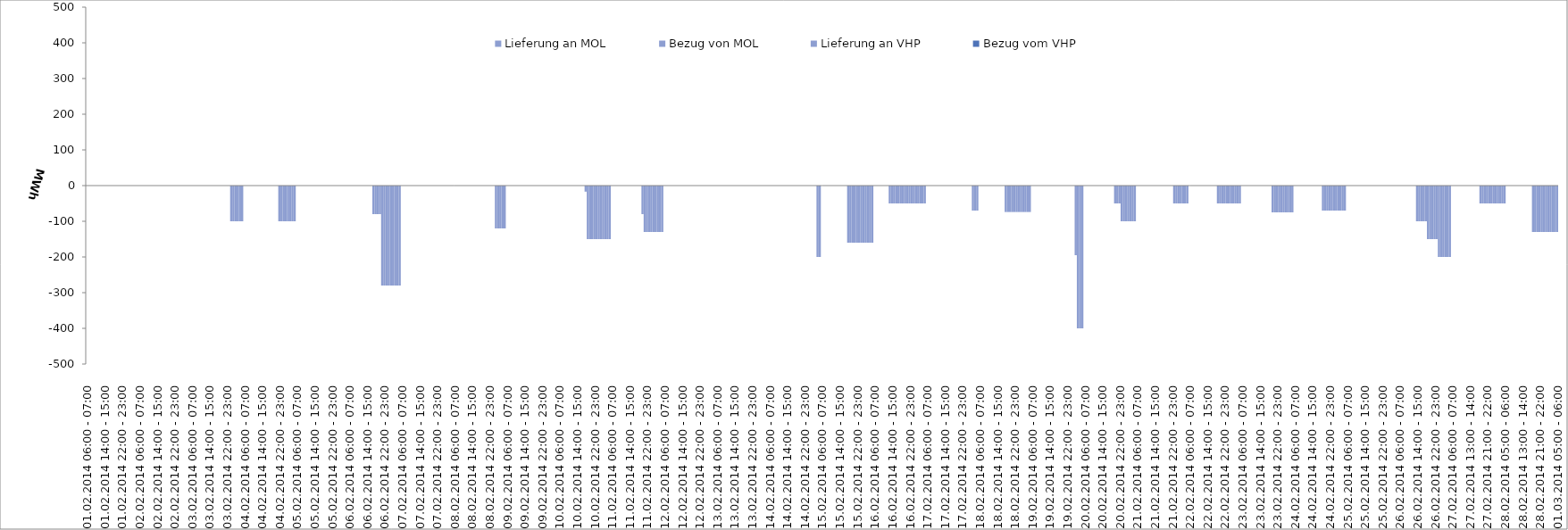
| Category | Bezug vom VHP | Lieferung an VHP | Bezug von MOL | Lieferung an MOL |
|---|---|---|---|---|
| 01.02.2014 06:00 - 07:00 | 0 | 0 | 0 | 0 |
| 01.02.2014 07:00 - 08:00 | 0 | 0 | 0 | 0 |
| 01.02.2014 08:00 - 09:00 | 0 | 0 | 0 | 0 |
| 01.02.2014 09:00 - 10:00 | 0 | 0 | 0 | 0 |
| 01.02.2014 10:00 - 11:00 | 0 | 0 | 0 | 0 |
| 01.02.2014 11:00 - 12:00 | 0 | 0 | 0 | 0 |
| 01.02.2014 12:00 - 13:00 | 0 | 0 | 0 | 0 |
| 01.02.2014 13:00 - 14:00 | 0 | 0 | 0 | 0 |
| 01.02.2014 14:00 - 15:00 | 0 | 0 | 0 | 0 |
| 01.02.2014 15:00 - 16:00 | 0 | 0 | 0 | 0 |
| 01.02.2014 16:00 - 17:00 | 0 | 0 | 0 | 0 |
| 01.02.2014 17:00 - 18:00 | 0 | 0 | 0 | 0 |
| 01.02.2014 18:00 - 19:00 | 0 | 0 | 0 | 0 |
| 01.02.2014 19:00 - 20:00 | 0 | 0 | 0 | 0 |
| 01.02.2014 20:00 - 21:00 | 0 | 0 | 0 | 0 |
| 01.02.2014 21:00 - 22:00 | 0 | 0 | 0 | 0 |
| 01.02.2014 22:00 - 23:00 | 0 | 0 | 0 | 0 |
| 01.02.2014 23:00 - 24:00 | 0 | 0 | 0 | 0 |
| 02.02.2014 00:00 - 01:00 | 0 | 0 | 0 | 0 |
| 02.02.2014 01:00 - 02:00 | 0 | 0 | 0 | 0 |
| 02.02.2014 02:00 - 03:00 | 0 | 0 | 0 | 0 |
| 02.02.2014 03:00 - 04:00 | 0 | 0 | 0 | 0 |
| 02.02.2014 04:00 - 05:00 | 0 | 0 | 0 | 0 |
| 02.02.2014 05:00 - 06:00 | 0 | 0 | 0 | 0 |
| 02.02.2014 06:00 - 07:00 | 0 | 0 | 0 | 0 |
| 02.02.2014 07:00 - 08:00 | 0 | 0 | 0 | 0 |
| 02.02.2014 08:00 - 09:00 | 0 | 0 | 0 | 0 |
| 02.02.2014 09:00 - 10:00 | 0 | 0 | 0 | 0 |
| 02.02.2014 10:00 - 11:00 | 0 | 0 | 0 | 0 |
| 02.02.2014 11:00 - 12:00 | 0 | 0 | 0 | 0 |
| 02.02.2014 12:00 - 13:00 | 0 | 0 | 0 | 0 |
| 02.02.2014 13:00 - 14:00 | 0 | 0 | 0 | 0 |
| 02.02.2014 14:00 - 15:00 | 0 | 0 | 0 | 0 |
| 02.02.2014 15:00 - 16:00 | 0 | 0 | 0 | 0 |
| 02.02.2014 16:00 - 17:00 | 0 | 0 | 0 | 0 |
| 02.02.2014 17:00 - 18:00 | 0 | 0 | 0 | 0 |
| 02.02.2014 18:00 - 19:00 | 0 | 0 | 0 | 0 |
| 02.02.2014 19:00 - 20:00 | 0 | 0 | 0 | 0 |
| 02.02.2014 20:00 - 21:00 | 0 | 0 | 0 | 0 |
| 02.02.2014 21:00 - 22:00 | 0 | 0 | 0 | 0 |
| 02.02.2014 22:00 - 23:00 | 0 | 0 | 0 | 0 |
| 02.02.2014 23:00 - 24:00 | 0 | 0 | 0 | 0 |
| 03.02.2014 00:00 - 01:00 | 0 | 0 | 0 | 0 |
| 03.02.2014 01:00 - 02:00 | 0 | 0 | 0 | 0 |
| 03.02.2014 02:00 - 03:00 | 0 | 0 | 0 | 0 |
| 03.02.2014 03:00 - 04:00 | 0 | 0 | 0 | 0 |
| 03.02.2014 04:00 - 05:00 | 0 | 0 | 0 | 0 |
| 03.02.2014 05:00 - 06:00 | 0 | 0 | 0 | 0 |
| 03.02.2014 06:00 - 07:00 | 0 | 0 | 0 | 0 |
| 03.02.2014 07:00 - 08:00 | 0 | 0 | 0 | 0 |
| 03.02.2014 08:00 - 09:00 | 0 | 0 | 0 | 0 |
| 03.02.2014 09:00 - 10:00 | 0 | 0 | 0 | 0 |
| 03.02.2014 10:00 - 11:00 | 0 | 0 | 0 | 0 |
| 03.02.2014 11:00 - 12:00 | 0 | 0 | 0 | 0 |
| 03.02.2014 12:00 - 13:00 | 0 | 0 | 0 | 0 |
| 03.02.2014 13:00 - 14:00 | 0 | 0 | 0 | 0 |
| 03.02.2014 14:00 - 15:00 | 0 | 0 | 0 | 0 |
| 03.02.2014 15:00 - 16:00 | 0 | 0 | 0 | 0 |
| 03.02.2014 16:00 - 17:00 | 0 | 0 | 0 | 0 |
| 03.02.2014 17:00 - 18:00 | 0 | 0 | 0 | 0 |
| 03.02.2014 18:00 - 19:00 | 0 | 0 | 0 | 0 |
| 03.02.2014 19:00 - 20:00 | 0 | 0 | 0 | 0 |
| 03.02.2014 20:00 - 21:00 | 0 | 0 | 0 | 0 |
| 03.02.2014 21:00 - 22:00 | 0 | 0 | 0 | 0 |
| 03.02.2014 22:00 - 23:00 | 0 | 0 | 0 | 0 |
| 03.02.2014 23:00 - 24:00 | 0 | 0 | 0 | 0 |
| 04.02.2014 00:00 - 01:00 | 0 | -100 | 0 | 0 |
| 04.02.2014 01:00 - 02:00 | 0 | -100 | 0 | 0 |
| 04.02.2014 02:00 - 03:00 | 0 | -100 | 0 | 0 |
| 04.02.2014 03:00 - 04:00 | 0 | -100 | 0 | 0 |
| 04.02.2014 04:00 - 05:00 | 0 | -100 | 0 | 0 |
| 04.02.2014 05:00 - 06:00 | 0 | -100 | 0 | 0 |
| 04.02.2014 06:00 - 07:00 | 0 | 0 | 0 | 0 |
| 04.02.2014 07:00 - 08:00 | 0 | 0 | 0 | 0 |
| 04.02.2014 08:00 - 09:00 | 0 | 0 | 0 | 0 |
| 04.02.2014 09:00 - 10:00 | 0 | 0 | 0 | 0 |
| 04.02.2014 10:00 - 11:00 | 0 | 0 | 0 | 0 |
| 04.02.2014 11:00 - 12:00 | 0 | 0 | 0 | 0 |
| 04.02.2014 12:00 - 13:00 | 0 | 0 | 0 | 0 |
| 04.02.2014 13:00 - 14:00 | 0 | 0 | 0 | 0 |
| 04.02.2014 14:00 - 15:00 | 0 | 0 | 0 | 0 |
| 04.02.2014 15:00 - 16:00 | 0 | 0 | 0 | 0 |
| 04.02.2014 16:00 - 17:00 | 0 | 0 | 0 | 0 |
| 04.02.2014 17:00 - 18:00 | 0 | 0 | 0 | 0 |
| 04.02.2014 18:00 - 19:00 | 0 | 0 | 0 | 0 |
| 04.02.2014 19:00 - 20:00 | 0 | 0 | 0 | 0 |
| 04.02.2014 20:00 - 21:00 | 0 | 0 | 0 | 0 |
| 04.02.2014 21:00 - 22:00 | 0 | 0 | 0 | 0 |
| 04.02.2014 22:00 - 23:00 | 0 | -100 | 0 | 0 |
| 04.02.2014 23:00 - 24:00 | 0 | -100 | 0 | 0 |
| 05.02.2014 00:00 - 01:00 | 0 | -100 | 0 | 0 |
| 05.02.2014 01:00 - 02:00 | 0 | -100 | 0 | 0 |
| 05.02.2014 02:00 - 03:00 | 0 | -100 | 0 | 0 |
| 05.02.2014 03:00 - 04:00 | 0 | -100 | 0 | 0 |
| 05.02.2014 04:00 - 05:00 | 0 | -100 | 0 | 0 |
| 05.02.2014 05:00 - 06:00 | 0 | -100 | 0 | 0 |
| 05.02.2014 06:00 - 07:00 | 0 | 0 | 0 | 0 |
| 05.02.2014 07:00 - 08:00 | 0 | 0 | 0 | 0 |
| 05.02.2014 08:00 - 09:00 | 0 | 0 | 0 | 0 |
| 05.02.2014 09:00 - 10:00 | 0 | 0 | 0 | 0 |
| 05.02.2014 10:00 - 11:00 | 0 | 0 | 0 | 0 |
| 05.02.2014 11:00 - 12:00 | 0 | 0 | 0 | 0 |
| 05.02.2014 12:00 - 13:00 | 0 | 0 | 0 | 0 |
| 05.02.2014 13:00 - 14:00 | 0 | 0 | 0 | 0 |
| 05.02.2014 14:00 - 15:00 | 0 | 0 | 0 | 0 |
| 05.02.2014 15:00 - 16:00 | 0 | 0 | 0 | 0 |
| 05.02.2014 16:00 - 17:00 | 0 | 0 | 0 | 0 |
| 05.02.2014 17:00 - 18:00 | 0 | 0 | 0 | 0 |
| 05.02.2014 18:00 - 19:00 | 0 | 0 | 0 | 0 |
| 05.02.2014 19:00 - 20:00 | 0 | 0 | 0 | 0 |
| 05.02.2014 20:00 - 21:00 | 0 | 0 | 0 | 0 |
| 05.02.2014 21:00 - 22:00 | 0 | 0 | 0 | 0 |
| 05.02.2014 22:00 - 23:00 | 0 | 0 | 0 | 0 |
| 05.02.2014 23:00 - 24:00 | 0 | 0 | 0 | 0 |
| 06.02.2014 00:00 - 01:00 | 0 | 0 | 0 | 0 |
| 06.02.2014 01:00 - 02:00 | 0 | 0 | 0 | 0 |
| 06.02.2014 02:00 - 03:00 | 0 | 0 | 0 | 0 |
| 06.02.2014 03:00 - 04:00 | 0 | 0 | 0 | 0 |
| 06.02.2014 04:00 - 05:00 | 0 | 0 | 0 | 0 |
| 06.02.2014 05:00 - 06:00 | 0 | 0 | 0 | 0 |
| 06.02.2014 06:00 - 07:00 | 0 | 0 | 0 | 0 |
| 06.02.2014 07:00 - 08:00 | 0 | 0 | 0 | 0 |
| 06.02.2014 08:00 - 09:00 | 0 | 0 | 0 | 0 |
| 06.02.2014 09:00 - 10:00 | 0 | 0 | 0 | 0 |
| 06.02.2014 10:00 - 11:00 | 0 | 0 | 0 | 0 |
| 06.02.2014 11:00 - 12:00 | 0 | 0 | 0 | 0 |
| 06.02.2014 12:00 - 13:00 | 0 | 0 | 0 | 0 |
| 06.02.2014 13:00 - 14:00 | 0 | 0 | 0 | 0 |
| 06.02.2014 14:00 - 15:00 | 0 | 0 | 0 | 0 |
| 06.02.2014 15:00 - 16:00 | 0 | 0 | 0 | 0 |
| 06.02.2014 16:00 - 17:00 | 0 | 0 | 0 | 0 |
| 06.02.2014 17:00 - 18:00 | 0 | -80 | 0 | 0 |
| 06.02.2014 18:00 - 19:00 | 0 | -80 | 0 | 0 |
| 06.02.2014 19:00 - 20:00 | 0 | -80 | 0 | 0 |
| 06.02.2014 20:00 - 21:00 | 0 | -80 | 0 | 0 |
| 06.02.2014 21:00 - 22:00 | 0 | -280 | 0 | 0 |
| 06.02.2014 22:00 - 23:00 | 0 | -280 | 0 | 0 |
| 06.02.2014 23:00 - 24:00 | 0 | -280 | 0 | 0 |
| 07.02.2014 00:00 - 01:00 | 0 | -280 | 0 | 0 |
| 07.02.2014 01:00 - 02:00 | 0 | -280 | 0 | 0 |
| 07.02.2014 02:00 - 03:00 | 0 | -280 | 0 | 0 |
| 07.02.2014 03:00 - 04:00 | 0 | -280 | 0 | 0 |
| 07.02.2014 04:00 - 05:00 | 0 | -280 | 0 | 0 |
| 07.02.2014 05:00 - 06:00 | 0 | -280 | 0 | 0 |
| 07.02.2014 06:00 - 07:00 | 0 | 0 | 0 | 0 |
| 07.02.2014 07:00 - 08:00 | 0 | 0 | 0 | 0 |
| 07.02.2014 08:00 - 09:00 | 0 | 0 | 0 | 0 |
| 07.02.2014 09:00 - 10:00 | 0 | 0 | 0 | 0 |
| 07.02.2014 10:00 - 11:00 | 0 | 0 | 0 | 0 |
| 07.02.2014 11:00 - 12:00 | 0 | 0 | 0 | 0 |
| 07.02.2014 12:00 - 13:00 | 0 | 0 | 0 | 0 |
| 07.02.2014 13:00 - 14:00 | 0 | 0 | 0 | 0 |
| 07.02.2014 14:00 - 15:00 | 0 | 0 | 0 | 0 |
| 07.02.2014 15:00 - 16:00 | 0 | 0 | 0 | 0 |
| 07.02.2014 16:00 - 17:00 | 0 | 0 | 0 | 0 |
| 07.02.2014 17:00 - 18:00 | 0 | 0 | 0 | 0 |
| 07.02.2014 18:00 - 19:00 | 0 | 0 | 0 | 0 |
| 07.02.2014 19:00 - 20:00 | 0 | 0 | 0 | 0 |
| 07.02.2014 20:00 - 21:00 | 0 | 0 | 0 | 0 |
| 07.02.2014 21:00 - 22:00 | 0 | 0 | 0 | 0 |
| 07.02.2014 22:00 - 23:00 | 0 | 0 | 0 | 0 |
| 07.02.2014 23:00 - 24:00 | 0 | 0 | 0 | 0 |
| 08.02.2014 00:00 - 01:00 | 0 | 0 | 0 | 0 |
| 08.02.2014 01:00 - 02:00 | 0 | 0 | 0 | 0 |
| 08.02.2014 02:00 - 03:00 | 0 | 0 | 0 | 0 |
| 08.02.2014 03:00 - 04:00 | 0 | 0 | 0 | 0 |
| 08.02.2014 04:00 - 05:00 | 0 | 0 | 0 | 0 |
| 08.02.2014 05:00 - 06:00 | 0 | 0 | 0 | 0 |
| 08.02.2014 06:00 - 07:00 | 0 | 0 | 0 | 0 |
| 08.02.2014 07:00 - 08:00 | 0 | 0 | 0 | 0 |
| 08.02.2014 08:00 - 09:00 | 0 | 0 | 0 | 0 |
| 08.02.2014 09:00 - 10:00 | 0 | 0 | 0 | 0 |
| 08.02.2014 10:00 - 11:00 | 0 | 0 | 0 | 0 |
| 08.02.2014 11:00 - 12:00 | 0 | 0 | 0 | 0 |
| 08.02.2014 12:00 - 13:00 | 0 | 0 | 0 | 0 |
| 08.02.2014 13:00 - 14:00 | 0 | 0 | 0 | 0 |
| 08.02.2014 14:00 - 15:00 | 0 | 0 | 0 | 0 |
| 08.02.2014 15:00 - 16:00 | 0 | 0 | 0 | 0 |
| 08.02.2014 16:00 - 17:00 | 0 | 0 | 0 | 0 |
| 08.02.2014 17:00 - 18:00 | 0 | 0 | 0 | 0 |
| 08.02.2014 18:00 - 19:00 | 0 | 0 | 0 | 0 |
| 08.02.2014 19:00 - 20:00 | 0 | 0 | 0 | 0 |
| 08.02.2014 20:00 - 21:00 | 0 | 0 | 0 | 0 |
| 08.02.2014 21:00 - 22:00 | 0 | 0 | 0 | 0 |
| 08.02.2014 22:00 - 23:00 | 0 | 0 | 0 | 0 |
| 08.02.2014 23:00 - 24:00 | 0 | 0 | 0 | 0 |
| 09.02.2014 00:00 - 01:00 | 0 | 0 | 0 | 0 |
| 09.02.2014 01:00 - 02:00 | 0 | -120 | 0 | 0 |
| 09.02.2014 02:00 - 03:00 | 0 | -120 | 0 | 0 |
| 09.02.2014 03:00 - 04:00 | 0 | -120 | 0 | 0 |
| 09.02.2014 04:00 - 05:00 | 0 | -120 | 0 | 0 |
| 09.02.2014 05:00 - 06:00 | 0 | -120 | 0 | 0 |
| 09.02.2014 06:00 - 07:00 | 0 | 0 | 0 | 0 |
| 09.02.2014 07:00 - 08:00 | 0 | 0 | 0 | 0 |
| 09.02.2014 08:00 - 09:00 | 0 | 0 | 0 | 0 |
| 09.02.2014 09:00 - 10:00 | 0 | 0 | 0 | 0 |
| 09.02.2014 10:00 - 11:00 | 0 | 0 | 0 | 0 |
| 09.02.2014 11:00 - 12:00 | 0 | 0 | 0 | 0 |
| 09.02.2014 12:00 - 13:00 | 0 | 0 | 0 | 0 |
| 09.02.2014 13:00 - 14:00 | 0 | 0 | 0 | 0 |
| 09.02.2014 14:00 - 15:00 | 0 | 0 | 0 | 0 |
| 09.02.2014 15:00 - 16:00 | 0 | 0 | 0 | 0 |
| 09.02.2014 16:00 - 17:00 | 0 | 0 | 0 | 0 |
| 09.02.2014 17:00 - 18:00 | 0 | 0 | 0 | 0 |
| 09.02.2014 18:00 - 19:00 | 0 | 0 | 0 | 0 |
| 09.02.2014 19:00 - 20:00 | 0 | 0 | 0 | 0 |
| 09.02.2014 20:00 - 21:00 | 0 | 0 | 0 | 0 |
| 09.02.2014 21:00 - 22:00 | 0 | 0 | 0 | 0 |
| 09.02.2014 22:00 - 23:00 | 0 | 0 | 0 | 0 |
| 09.02.2014 23:00 - 24:00 | 0 | 0 | 0 | 0 |
| 10.02.2014 00:00 - 01:00 | 0 | 0 | 0 | 0 |
| 10.02.2014 01:00 - 02:00 | 0 | 0 | 0 | 0 |
| 10.02.2014 02:00 - 03:00 | 0 | 0 | 0 | 0 |
| 10.02.2014 03:00 - 04:00 | 0 | 0 | 0 | 0 |
| 10.02.2014 04:00 - 05:00 | 0 | 0 | 0 | 0 |
| 10.02.2014 05:00 - 06:00 | 0 | 0 | 0 | 0 |
| 10.02.2014 06:00 - 07:00 | 0 | 0 | 0 | 0 |
| 10.02.2014 07:00 - 08:00 | 0 | 0 | 0 | 0 |
| 10.02.2014 08:00 - 09:00 | 0 | 0 | 0 | 0 |
| 10.02.2014 09:00 - 10:00 | 0 | 0 | 0 | 0 |
| 10.02.2014 10:00 - 11:00 | 0 | 0 | 0 | 0 |
| 10.02.2014 11:00 - 12:00 | 0 | 0 | 0 | 0 |
| 10.02.2014 12:00 - 13:00 | 0 | 0 | 0 | 0 |
| 10.02.2014 13:00 - 14:00 | 0 | 0 | 0 | 0 |
| 10.02.2014 14:00 - 15:00 | 0 | 0 | 0 | 0 |
| 10.02.2014 15:00 - 16:00 | 0 | 0 | 0 | 0 |
| 10.02.2014 16:00 - 17:00 | 0 | 0 | 0 | 0 |
| 10.02.2014 17:00 - 18:00 | 0 | 0 | 0 | 0 |
| 10.02.2014 18:00 - 19:00 | 0 | -17 | 0 | 0 |
| 10.02.2014 19:00 - 20:00 | 0 | -150 | 0 | 0 |
| 10.02.2014 20:00 - 21:00 | 0 | -150 | 0 | 0 |
| 10.02.2014 21:00 - 22:00 | 0 | -150 | 0 | 0 |
| 10.02.2014 22:00 - 23:00 | 0 | -150 | 0 | 0 |
| 10.02.2014 23:00 - 24:00 | 0 | -150 | 0 | 0 |
| 11.02.2014 00:00 - 01:00 | 0 | -150 | 0 | 0 |
| 11.02.2014 01:00 - 02:00 | 0 | -150 | 0 | 0 |
| 11.02.2014 02:00 - 03:00 | 0 | -150 | 0 | 0 |
| 11.02.2014 03:00 - 04:00 | 0 | -150 | 0 | 0 |
| 11.02.2014 04:00 - 05:00 | 0 | -150 | 0 | 0 |
| 11.02.2014 05:00 - 06:00 | 0 | -150 | 0 | 0 |
| 11.02.2014 06:00 - 07:00 | 0 | 0 | 0 | 0 |
| 11.02.2014 07:00 - 08:00 | 0 | 0 | 0 | 0 |
| 11.02.2014 08:00 - 09:00 | 0 | 0 | 0 | 0 |
| 11.02.2014 09:00 - 10:00 | 0 | 0 | 0 | 0 |
| 11.02.2014 10:00 - 11:00 | 0 | 0 | 0 | 0 |
| 11.02.2014 11:00 - 12:00 | 0 | 0 | 0 | 0 |
| 11.02.2014 12:00 - 13:00 | 0 | 0 | 0 | 0 |
| 11.02.2014 13:00 - 14:00 | 0 | 0 | 0 | 0 |
| 11.02.2014 14:00 - 15:00 | 0 | 0 | 0 | 0 |
| 11.02.2014 15:00 - 16:00 | 0 | 0 | 0 | 0 |
| 11.02.2014 16:00 - 17:00 | 0 | 0 | 0 | 0 |
| 11.02.2014 17:00 - 18:00 | 0 | 0 | 0 | 0 |
| 11.02.2014 18:00 - 19:00 | 0 | 0 | 0 | 0 |
| 11.02.2014 19:00 - 20:00 | 0 | 0 | 0 | 0 |
| 11.02.2014 20:00 - 21:00 | 0 | -80 | 0 | 0 |
| 11.02.2014 21:00 - 22:00 | 0 | -130 | 0 | 0 |
| 11.02.2014 22:00 - 23:00 | 0 | -130 | 0 | 0 |
| 11.02.2014 23:00 - 24:00 | 0 | -130 | 0 | 0 |
| 12.02.2014 00:00 - 01:00 | 0 | -130 | 0 | 0 |
| 12.02.2014 01:00 - 02:00 | 0 | -130 | 0 | 0 |
| 12.02.2014 02:00 - 03:00 | 0 | -130 | 0 | 0 |
| 12.02.2014 03:00 - 04:00 | 0 | -130 | 0 | 0 |
| 12.02.2014 04:00 - 05:00 | 0 | -130 | 0 | 0 |
| 12.02.2014 05:00 - 06:00 | 0 | -130 | 0 | 0 |
| 12.02.2014 06:00 - 07:00 | 0 | 0 | 0 | 0 |
| 12.02.2014 07:00 - 08:00 | 0 | 0 | 0 | 0 |
| 12.02.2014 08:00 - 09:00 | 0 | 0 | 0 | 0 |
| 12.02.2014 09:00 - 10:00 | 0 | 0 | 0 | 0 |
| 12.02.2014 10:00 - 11:00 | 0 | 0 | 0 | 0 |
| 12.02.2014 11:00 - 12:00 | 0 | 0 | 0 | 0 |
| 12.02.2014 12:00 - 13:00 | 0 | 0 | 0 | 0 |
| 12.02.2014 13:00 - 14:00 | 0 | 0 | 0 | 0 |
| 12.02.2014 14:00 - 15:00 | 0 | 0 | 0 | 0 |
| 12.02.2014 15:00 - 16:00 | 0 | 0 | 0 | 0 |
| 12.02.2014 16:00 - 17:00 | 0 | 0 | 0 | 0 |
| 12.02.2014 17:00 - 18:00 | 0 | 0 | 0 | 0 |
| 12.02.2014 18:00 - 19:00 | 0 | 0 | 0 | 0 |
| 12.02.2014 19:00 - 20:00 | 0 | 0 | 0 | 0 |
| 12.02.2014 20:00 - 21:00 | 0 | 0 | 0 | 0 |
| 12.02.2014 21:00 - 22:00 | 0 | 0 | 0 | 0 |
| 12.02.2014 22:00 - 23:00 | 0 | 0 | 0 | 0 |
| 12.02.2014 23:00 - 24:00 | 0 | 0 | 0 | 0 |
| 13.02.2014 00:00 - 01:00 | 0 | 0 | 0 | 0 |
| 13.02.2014 01:00 - 02:00 | 0 | 0 | 0 | 0 |
| 13.02.2014 02:00 - 03:00 | 0 | 0 | 0 | 0 |
| 13.02.2014 03:00 - 04:00 | 0 | 0 | 0 | 0 |
| 13.02.2014 04:00 - 05:00 | 0 | 0 | 0 | 0 |
| 13.02.2014 05:00 - 06:00 | 0 | 0 | 0 | 0 |
| 13.02.2014 06:00 - 07:00 | 0 | 0 | 0 | 0 |
| 13.02.2014 07:00 - 08:00 | 0 | 0 | 0 | 0 |
| 13.02.2014 08:00 - 09:00 | 0 | 0 | 0 | 0 |
| 13.02.2014 09:00 - 10:00 | 0 | 0 | 0 | 0 |
| 13.02.2014 10:00 - 11:00 | 0 | 0 | 0 | 0 |
| 13.02.2014 11:00 - 12:00 | 0 | 0 | 0 | 0 |
| 13.02.2014 12:00 - 13:00 | 0 | 0 | 0 | 0 |
| 13.02.2014 13:00 - 14:00 | 0 | 0 | 0 | 0 |
| 13.02.2014 14:00 - 15:00 | 0 | 0 | 0 | 0 |
| 13.02.2014 15:00 - 16:00 | 0 | 0 | 0 | 0 |
| 13.02.2014 16:00 - 17:00 | 0 | 0 | 0 | 0 |
| 13.02.2014 17:00 - 18:00 | 0 | 0 | 0 | 0 |
| 13.02.2014 18:00 - 19:00 | 0 | 0 | 0 | 0 |
| 13.02.2014 19:00 - 20:00 | 0 | 0 | 0 | 0 |
| 13.02.2014 20:00 - 21:00 | 0 | 0 | 0 | 0 |
| 13.02.2014 21:00 - 22:00 | 0 | 0 | 0 | 0 |
| 13.02.2014 22:00 - 23:00 | 0 | 0 | 0 | 0 |
| 13.02.2014 23:00 - 24:00 | 0 | 0 | 0 | 0 |
| 14.02.2014 00:00 - 01:00 | 0 | 0 | 0 | 0 |
| 14.02.2014 01:00 - 02:00 | 0 | 0 | 0 | 0 |
| 14.02.2014 02:00 - 03:00 | 0 | 0 | 0 | 0 |
| 14.02.2014 03:00 - 04:00 | 0 | 0 | 0 | 0 |
| 14.02.2014 04:00 - 05:00 | 0 | 0 | 0 | 0 |
| 14.02.2014 05:00 - 06:00 | 0 | 0 | 0 | 0 |
| 14.02.2014 06:00 - 07:00 | 0 | 0 | 0 | 0 |
| 14.02.2014 07:00 - 08:00 | 0 | 0 | 0 | 0 |
| 14.02.2014 08:00 - 09:00 | 0 | 0 | 0 | 0 |
| 14.02.2014 09:00 - 10:00 | 0 | 0 | 0 | 0 |
| 14.02.2014 10:00 - 11:00 | 0 | 0 | 0 | 0 |
| 14.02.2014 11:00 - 12:00 | 0 | 0 | 0 | 0 |
| 14.02.2014 12:00 - 13:00 | 0 | 0 | 0 | 0 |
| 14.02.2014 13:00 - 14:00 | 0 | 0 | 0 | 0 |
| 14.02.2014 14:00 - 15:00 | 0 | 0 | 0 | 0 |
| 14.02.2014 15:00 - 16:00 | 0 | 0 | 0 | 0 |
| 14.02.2014 16:00 - 17:00 | 0 | 0 | 0 | 0 |
| 14.02.2014 17:00 - 18:00 | 0 | 0 | 0 | 0 |
| 14.02.2014 18:00 - 19:00 | 0 | 0 | 0 | 0 |
| 14.02.2014 19:00 - 20:00 | 0 | 0 | 0 | 0 |
| 14.02.2014 20:00 - 21:00 | 0 | 0 | 0 | 0 |
| 14.02.2014 21:00 - 22:00 | 0 | 0 | 0 | 0 |
| 14.02.2014 22:00 - 23:00 | 0 | 0 | 0 | 0 |
| 14.02.2014 23:00 - 24:00 | 0 | 0 | 0 | 0 |
| 15.02.2014 00:00 - 01:00 | 0 | 0 | 0 | 0 |
| 15.02.2014 01:00 - 02:00 | 0 | 0 | 0 | 0 |
| 15.02.2014 02:00 - 03:00 | 0 | 0 | 0 | 0 |
| 15.02.2014 03:00 - 04:00 | 0 | 0 | 0 | 0 |
| 15.02.2014 04:00 - 05:00 | 0 | -200 | 0 | 0 |
| 15.02.2014 05:00 - 06:00 | 0 | -200 | 0 | 0 |
| 15.02.2014 06:00 - 07:00 | 0 | 0 | 0 | 0 |
| 15.02.2014 07:00 - 08:00 | 0 | 0 | 0 | 0 |
| 15.02.2014 08:00 - 09:00 | 0 | 0 | 0 | 0 |
| 15.02.2014 09:00 - 10:00 | 0 | 0 | 0 | 0 |
| 15.02.2014 10:00 - 11:00 | 0 | 0 | 0 | 0 |
| 15.02.2014 11:00 - 12:00 | 0 | 0 | 0 | 0 |
| 15.02.2014 12:00 - 13:00 | 0 | 0 | 0 | 0 |
| 15.02.2014 13:00 - 14:00 | 0 | 0 | 0 | 0 |
| 15.02.2014 14:00 - 15:00 | 0 | 0 | 0 | 0 |
| 15.02.2014 15:00 - 16:00 | 0 | 0 | 0 | 0 |
| 15.02.2014 16:00 - 17:00 | 0 | 0 | 0 | 0 |
| 15.02.2014 17:00 - 18:00 | 0 | 0 | 0 | 0 |
| 15.02.2014 18:00 - 19:00 | 0 | -160 | 0 | 0 |
| 15.02.2014 19:00 - 20:00 | 0 | -160 | 0 | 0 |
| 15.02.2014 20:00 - 21:00 | 0 | -160 | 0 | 0 |
| 15.02.2014 21:00 - 22:00 | 0 | -160 | 0 | 0 |
| 15.02.2014 22:00 - 23:00 | 0 | -160 | 0 | 0 |
| 15.02.2014 23:00 - 24:00 | 0 | -160 | 0 | 0 |
| 16.02.2014 00:00 - 01:00 | 0 | -160 | 0 | 0 |
| 16.02.2014 01:00 - 02:00 | 0 | -160 | 0 | 0 |
| 16.02.2014 02:00 - 03:00 | 0 | -160 | 0 | 0 |
| 16.02.2014 03:00 - 04:00 | 0 | -160 | 0 | 0 |
| 16.02.2014 04:00 - 05:00 | 0 | -160 | 0 | 0 |
| 16.02.2014 05:00 - 06:00 | 0 | -160 | 0 | 0 |
| 16.02.2014 06:00 - 07:00 | 0 | 0 | 0 | 0 |
| 16.02.2014 07:00 - 08:00 | 0 | 0 | 0 | 0 |
| 16.02.2014 08:00 - 09:00 | 0 | 0 | 0 | 0 |
| 16.02.2014 09:00 - 10:00 | 0 | 0 | 0 | 0 |
| 16.02.2014 10:00 - 11:00 | 0 | 0 | 0 | 0 |
| 16.02.2014 11:00 - 12:00 | 0 | 0 | 0 | 0 |
| 16.02.2014 12:00 - 13:00 | 0 | 0 | 0 | 0 |
| 16.02.2014 13:00 - 14:00 | 0 | -50 | 0 | 0 |
| 16.02.2014 14:00 - 15:00 | 0 | -50 | 0 | 0 |
| 16.02.2014 15:00 - 16:00 | 0 | -50 | 0 | 0 |
| 16.02.2014 16:00 - 17:00 | 0 | -50 | 0 | 0 |
| 16.02.2014 17:00 - 18:00 | 0 | -50 | 0 | 0 |
| 16.02.2014 18:00 - 19:00 | 0 | -50 | 0 | 0 |
| 16.02.2014 19:00 - 20:00 | 0 | -50 | 0 | 0 |
| 16.02.2014 20:00 - 21:00 | 0 | -50 | 0 | 0 |
| 16.02.2014 21:00 - 22:00 | 0 | -50 | 0 | 0 |
| 16.02.2014 22:00 - 23:00 | 0 | -50 | 0 | 0 |
| 16.02.2014 23:00 - 24:00 | 0 | -50 | 0 | 0 |
| 17.02.2014 00:00 - 01:00 | 0 | -50 | 0 | 0 |
| 17.02.2014 01:00 - 02:00 | 0 | -50 | 0 | 0 |
| 17.02.2014 02:00 - 03:00 | 0 | -50 | 0 | 0 |
| 17.02.2014 03:00 - 04:00 | 0 | -50 | 0 | 0 |
| 17.02.2014 04:00 - 05:00 | 0 | -50 | 0 | 0 |
| 17.02.2014 05:00 - 06:00 | 0 | -50 | 0 | 0 |
| 17.02.2014 06:00 - 07:00 | 0 | 0 | 0 | 0 |
| 17.02.2014 07:00 - 08:00 | 0 | 0 | 0 | 0 |
| 17.02.2014 08:00 - 09:00 | 0 | 0 | 0 | 0 |
| 17.02.2014 09:00 - 10:00 | 0 | 0 | 0 | 0 |
| 17.02.2014 10:00 - 11:00 | 0 | 0 | 0 | 0 |
| 17.02.2014 11:00 - 12:00 | 0 | 0 | 0 | 0 |
| 17.02.2014 12:00 - 13:00 | 0 | 0 | 0 | 0 |
| 17.02.2014 13:00 - 14:00 | 0 | 0 | 0 | 0 |
| 17.02.2014 14:00 - 15:00 | 0 | 0 | 0 | 0 |
| 17.02.2014 15:00 - 16:00 | 0 | 0 | 0 | 0 |
| 17.02.2014 16:00 - 17:00 | 0 | 0 | 0 | 0 |
| 17.02.2014 17:00 - 18:00 | 0 | 0 | 0 | 0 |
| 17.02.2014 18:00 - 19:00 | 0 | 0 | 0 | 0 |
| 17.02.2014 19:00 - 20:00 | 0 | 0 | 0 | 0 |
| 17.02.2014 20:00 - 21:00 | 0 | 0 | 0 | 0 |
| 17.02.2014 21:00 - 22:00 | 0 | 0 | 0 | 0 |
| 17.02.2014 22:00 - 23:00 | 0 | 0 | 0 | 0 |
| 17.02.2014 23:00 - 24:00 | 0 | 0 | 0 | 0 |
| 18.02.2014 00:00 - 01:00 | 0 | 0 | 0 | 0 |
| 18.02.2014 01:00 - 02:00 | 0 | 0 | 0 | 0 |
| 18.02.2014 02:00 - 03:00 | 0 | 0 | 0 | 0 |
| 18.02.2014 03:00 - 04:00 | 0 | -70 | 0 | 0 |
| 18.02.2014 04:00 - 05:00 | 0 | -70 | 0 | 0 |
| 18.02.2014 05:00 - 06:00 | 0 | -70 | 0 | 0 |
| 18.02.2014 06:00 - 07:00 | 0 | 0 | 0 | 0 |
| 18.02.2014 07:00 - 08:00 | 0 | 0 | 0 | 0 |
| 18.02.2014 08:00 - 09:00 | 0 | 0 | 0 | 0 |
| 18.02.2014 09:00 - 10:00 | 0 | 0 | 0 | 0 |
| 18.02.2014 10:00 - 11:00 | 0 | 0 | 0 | 0 |
| 18.02.2014 11:00 - 12:00 | 0 | 0 | 0 | 0 |
| 18.02.2014 12:00 - 13:00 | 0 | 0 | 0 | 0 |
| 18.02.2014 13:00 - 14:00 | 0 | 0 | 0 | 0 |
| 18.02.2014 14:00 - 15:00 | 0 | 0 | 0 | 0 |
| 18.02.2014 15:00 - 16:00 | 0 | 0 | 0 | 0 |
| 18.02.2014 16:00 - 17:00 | 0 | 0 | 0 | 0 |
| 18.02.2014 17:00 - 18:00 | 0 | 0 | 0 | 0 |
| 18.02.2014 18:00 - 19:00 | 0 | -74 | 0 | 0 |
| 18.02.2014 19:00 - 20:00 | 0 | -74 | 0 | 0 |
| 18.02.2014 20:00 - 21:00 | 0 | -74 | 0 | 0 |
| 18.02.2014 21:00 - 22:00 | 0 | -74 | 0 | 0 |
| 18.02.2014 22:00 - 23:00 | 0 | -74 | 0 | 0 |
| 18.02.2014 23:00 - 24:00 | 0 | -74 | 0 | 0 |
| 19.02.2014 00:00 - 01:00 | 0 | -74 | 0 | 0 |
| 19.02.2014 01:00 - 02:00 | 0 | -74 | 0 | 0 |
| 19.02.2014 02:00 - 03:00 | 0 | -74 | 0 | 0 |
| 19.02.2014 03:00 - 04:00 | 0 | -74 | 0 | 0 |
| 19.02.2014 04:00 - 05:00 | 0 | -74 | 0 | 0 |
| 19.02.2014 05:00 - 06:00 | 0 | -74 | 0 | 0 |
| 19.02.2014 06:00 - 07:00 | 0 | 0 | 0 | 0 |
| 19.02.2014 07:00 - 08:00 | 0 | 0 | 0 | 0 |
| 19.02.2014 08:00 - 09:00 | 0 | 0 | 0 | 0 |
| 19.02.2014 09:00 - 10:00 | 0 | 0 | 0 | 0 |
| 19.02.2014 10:00 - 11:00 | 0 | 0 | 0 | 0 |
| 19.02.2014 11:00 - 12:00 | 0 | 0 | 0 | 0 |
| 19.02.2014 12:00 - 13:00 | 0 | 0 | 0 | 0 |
| 19.02.2014 13:00 - 14:00 | 0 | 0 | 0 | 0 |
| 19.02.2014 14:00 - 15:00 | 0 | 0 | 0 | 0 |
| 19.02.2014 15:00 - 16:00 | 0 | 0 | 0 | 0 |
| 19.02.2014 16:00 - 17:00 | 0 | 0 | 0 | 0 |
| 19.02.2014 17:00 - 18:00 | 0 | 0 | 0 | 0 |
| 19.02.2014 18:00 - 19:00 | 0 | 0 | 0 | 0 |
| 19.02.2014 19:00 - 20:00 | 0 | 0 | 0 | 0 |
| 19.02.2014 20:00 - 21:00 | 0 | 0 | 0 | 0 |
| 19.02.2014 21:00 - 22:00 | 0 | 0 | 0 | 0 |
| 19.02.2014 22:00 - 23:00 | 0 | 0 | 0 | 0 |
| 19.02.2014 23:00 - 24:00 | 0 | 0 | 0 | 0 |
| 20.02.2014 00:00 - 01:00 | 0 | 0 | 0 | 0 |
| 20.02.2014 01:00 - 02:00 | 0 | 0 | 0 | 0 |
| 20.02.2014 02:00 - 03:00 | 0 | -195 | 0 | 0 |
| 20.02.2014 03:00 - 04:00 | 0 | -400 | 0 | 0 |
| 20.02.2014 04:00 - 05:00 | 0 | -400 | 0 | 0 |
| 20.02.2014 05:00 - 06:00 | 0 | -400 | 0 | 0 |
| 20.02.2014 06:00 - 07:00 | 0 | 0 | 0 | 0 |
| 20.02.2014 07:00 - 08:00 | 0 | 0 | 0 | 0 |
| 20.02.2014 08:00 - 09:00 | 0 | 0 | 0 | 0 |
| 20.02.2014 09:00 - 10:00 | 0 | 0 | 0 | 0 |
| 20.02.2014 10:00 - 11:00 | 0 | 0 | 0 | 0 |
| 20.02.2014 11:00 - 12:00 | 0 | 0 | 0 | 0 |
| 20.02.2014 12:00 - 13:00 | 0 | 0 | 0 | 0 |
| 20.02.2014 13:00 - 14:00 | 0 | 0 | 0 | 0 |
| 20.02.2014 14:00 - 15:00 | 0 | 0 | 0 | 0 |
| 20.02.2014 15:00 - 16:00 | 0 | 0 | 0 | 0 |
| 20.02.2014 16:00 - 17:00 | 0 | 0 | 0 | 0 |
| 20.02.2014 17:00 - 18:00 | 0 | 0 | 0 | 0 |
| 20.02.2014 18:00 - 19:00 | 0 | 0 | 0 | 0 |
| 20.02.2014 19:00 - 20:00 | 0 | 0 | 0 | 0 |
| 20.02.2014 20:00 - 21:00 | 0 | -50 | 0 | 0 |
| 20.02.2014 21:00 - 22:00 | 0 | -50 | 0 | 0 |
| 20.02.2014 22:00 - 23:00 | 0 | -50 | 0 | 0 |
| 20.02.2014 23:00 - 24:00 | 0 | -100 | 0 | 0 |
| 21.02.2014 00:00 - 01:00 | 0 | -100 | 0 | 0 |
| 21.02.2014 01:00 - 02:00 | 0 | -100 | 0 | 0 |
| 21.02.2014 02:00 - 03:00 | 0 | -100 | 0 | 0 |
| 21.02.2014 03:00 - 04:00 | 0 | -100 | 0 | 0 |
| 21.02.2014 04:00 - 05:00 | 0 | -100 | 0 | 0 |
| 21.02.2014 05:00 - 06:00 | 0 | -100 | 0 | 0 |
| 21.02.2014 06:00 - 07:00 | 0 | 0 | 0 | 0 |
| 21.02.2014 07:00 - 08:00 | 0 | 0 | 0 | 0 |
| 21.02.2014 08:00 - 09:00 | 0 | 0 | 0 | 0 |
| 21.02.2014 09:00 - 10:00 | 0 | 0 | 0 | 0 |
| 21.02.2014 10:00 - 11:00 | 0 | 0 | 0 | 0 |
| 21.02.2014 11:00 - 12:00 | 0 | 0 | 0 | 0 |
| 21.02.2014 12:00 - 13:00 | 0 | 0 | 0 | 0 |
| 21.02.2014 13:00 - 14:00 | 0 | 0 | 0 | 0 |
| 21.02.2014 14:00 - 15:00 | 0 | 0 | 0 | 0 |
| 21.02.2014 15:00 - 16:00 | 0 | 0 | 0 | 0 |
| 21.02.2014 16:00 - 17:00 | 0 | 0 | 0 | 0 |
| 21.02.2014 17:00 - 18:00 | 0 | 0 | 0 | 0 |
| 21.02.2014 18:00 - 19:00 | 0 | 0 | 0 | 0 |
| 21.02.2014 19:00 - 20:00 | 0 | 0 | 0 | 0 |
| 21.02.2014 20:00 - 21:00 | 0 | 0 | 0 | 0 |
| 21.02.2014 21:00 - 22:00 | 0 | 0 | 0 | 0 |
| 21.02.2014 22:00 - 23:00 | 0 | 0 | 0 | 0 |
| 21.02.2014 23:00 - 24:00 | 0 | -50 | 0 | 0 |
| 22.02.2014 00:00 - 01:00 | 0 | -50 | 0 | 0 |
| 22.02.2014 01:00 - 02:00 | 0 | -50 | 0 | 0 |
| 22.02.2014 02:00 - 03:00 | 0 | -50 | 0 | 0 |
| 22.02.2014 03:00 - 04:00 | 0 | -50 | 0 | 0 |
| 22.02.2014 04:00 - 05:00 | 0 | -50 | 0 | 0 |
| 22.02.2014 05:00 - 06:00 | 0 | -50 | 0 | 0 |
| 22.02.2014 06:00 - 07:00 | 0 | 0 | 0 | 0 |
| 22.02.2014 07:00 - 08:00 | 0 | 0 | 0 | 0 |
| 22.02.2014 08:00 - 09:00 | 0 | 0 | 0 | 0 |
| 22.02.2014 09:00 - 10:00 | 0 | 0 | 0 | 0 |
| 22.02.2014 10:00 - 11:00 | 0 | 0 | 0 | 0 |
| 22.02.2014 11:00 - 12:00 | 0 | 0 | 0 | 0 |
| 22.02.2014 12:00 - 13:00 | 0 | 0 | 0 | 0 |
| 22.02.2014 13:00 - 14:00 | 0 | 0 | 0 | 0 |
| 22.02.2014 14:00 - 15:00 | 0 | 0 | 0 | 0 |
| 22.02.2014 15:00 - 16:00 | 0 | 0 | 0 | 0 |
| 22.02.2014 16:00 - 17:00 | 0 | 0 | 0 | 0 |
| 22.02.2014 17:00 - 18:00 | 0 | 0 | 0 | 0 |
| 22.02.2014 18:00 - 19:00 | 0 | 0 | 0 | 0 |
| 22.02.2014 19:00 - 20:00 | 0 | -50 | 0 | 0 |
| 22.02.2014 20:00 - 21:00 | 0 | -50 | 0 | 0 |
| 22.02.2014 21:00 - 22:00 | 0 | -50 | 0 | 0 |
| 22.02.2014 22:00 - 23:00 | 0 | -50 | 0 | 0 |
| 22.02.2014 23:00 - 24:00 | 0 | -50 | 0 | 0 |
| 23.02.2014 00:00 - 01:00 | 0 | -50 | 0 | 0 |
| 23.02.2014 01:00 - 02:00 | 0 | -50 | 0 | 0 |
| 23.02.2014 02:00 - 03:00 | 0 | -50 | 0 | 0 |
| 23.02.2014 03:00 - 04:00 | 0 | -50 | 0 | 0 |
| 23.02.2014 04:00 - 05:00 | 0 | -50 | 0 | 0 |
| 23.02.2014 05:00 - 06:00 | 0 | -50 | 0 | 0 |
| 23.02.2014 06:00 - 07:00 | 0 | 0 | 0 | 0 |
| 23.02.2014 07:00 - 08:00 | 0 | 0 | 0 | 0 |
| 23.02.2014 08:00 - 09:00 | 0 | 0 | 0 | 0 |
| 23.02.2014 09:00 - 10:00 | 0 | 0 | 0 | 0 |
| 23.02.2014 10:00 - 11:00 | 0 | 0 | 0 | 0 |
| 23.02.2014 11:00 - 12:00 | 0 | 0 | 0 | 0 |
| 23.02.2014 12:00 - 13:00 | 0 | 0 | 0 | 0 |
| 23.02.2014 13:00 - 14:00 | 0 | 0 | 0 | 0 |
| 23.02.2014 14:00 - 15:00 | 0 | 0 | 0 | 0 |
| 23.02.2014 15:00 - 16:00 | 0 | 0 | 0 | 0 |
| 23.02.2014 16:00 - 17:00 | 0 | 0 | 0 | 0 |
| 23.02.2014 17:00 - 18:00 | 0 | 0 | 0 | 0 |
| 23.02.2014 18:00 - 19:00 | 0 | 0 | 0 | 0 |
| 23.02.2014 19:00 - 20:00 | 0 | 0 | 0 | 0 |
| 23.02.2014 20:00 - 21:00 | 0 | -75 | 0 | 0 |
| 23.02.2014 21:00 - 22:00 | 0 | -75 | 0 | 0 |
| 23.02.2014 22:00 - 23:00 | 0 | -75 | 0 | 0 |
| 23.02.2014 23:00 - 24:00 | 0 | -75 | 0 | 0 |
| 24.02.2014 00:00 - 01:00 | 0 | -75 | 0 | 0 |
| 24.02.2014 01:00 - 02:00 | 0 | -75 | 0 | 0 |
| 24.02.2014 02:00 - 03:00 | 0 | -75 | 0 | 0 |
| 24.02.2014 03:00 - 04:00 | 0 | -75 | 0 | 0 |
| 24.02.2014 04:00 - 05:00 | 0 | -75 | 0 | 0 |
| 24.02.2014 05:00 - 06:00 | 0 | -75 | 0 | 0 |
| 24.02.2014 06:00 - 07:00 | 0 | 0 | 0 | 0 |
| 24.02.2014 07:00 - 08:00 | 0 | 0 | 0 | 0 |
| 24.02.2014 08:00 - 09:00 | 0 | 0 | 0 | 0 |
| 24.02.2014 09:00 - 10:00 | 0 | 0 | 0 | 0 |
| 24.02.2014 10:00 - 11:00 | 0 | 0 | 0 | 0 |
| 24.02.2014 11:00 - 12:00 | 0 | 0 | 0 | 0 |
| 24.02.2014 12:00 - 13:00 | 0 | 0 | 0 | 0 |
| 24.02.2014 13:00 - 14:00 | 0 | 0 | 0 | 0 |
| 24.02.2014 14:00 - 15:00 | 0 | 0 | 0 | 0 |
| 24.02.2014 15:00 - 16:00 | 0 | 0 | 0 | 0 |
| 24.02.2014 16:00 - 17:00 | 0 | 0 | 0 | 0 |
| 24.02.2014 17:00 - 18:00 | 0 | 0 | 0 | 0 |
| 24.02.2014 18:00 - 19:00 | 0 | 0 | 0 | 0 |
| 24.02.2014 19:00 - 20:00 | 0 | -70 | 0 | 0 |
| 24.02.2014 20:00 - 21:00 | 0 | -70 | 0 | 0 |
| 24.02.2014 21:00 - 22:00 | 0 | -70 | 0 | 0 |
| 24.02.2014 22:00 - 23:00 | 0 | -70 | 0 | 0 |
| 24.02.2014 23:00 - 24:00 | 0 | -70 | 0 | 0 |
| 25.02.2014 00:00 - 01:00 | 0 | -70 | 0 | 0 |
| 25.02.2014 01:00 - 02:00 | 0 | -70 | 0 | 0 |
| 25.02.2014 02:00 - 03:00 | 0 | -70 | 0 | 0 |
| 25.02.2014 03:00 - 04:00 | 0 | -70 | 0 | 0 |
| 25.02.2014 04:00 - 05:00 | 0 | -70 | 0 | 0 |
| 25.02.2014 05:00 - 06:00 | 0 | -70 | 0 | 0 |
| 25.02.2014 06:00 - 07:00 | 0 | 0 | 0 | 0 |
| 25.02.2014 07:00 - 08:00 | 0 | 0 | 0 | 0 |
| 25.02.2014 08:00 - 09:00 | 0 | 0 | 0 | 0 |
| 25.02.2014 09:00 - 10:00 | 0 | 0 | 0 | 0 |
| 25.02.2014 10:00 - 11:00 | 0 | 0 | 0 | 0 |
| 25.02.2014 11:00 - 12:00 | 0 | 0 | 0 | 0 |
| 25.02.2014 12:00 - 13:00 | 0 | 0 | 0 | 0 |
| 25.02.2014 13:00 - 14:00 | 0 | 0 | 0 | 0 |
| 25.02.2014 14:00 - 15:00 | 0 | 0 | 0 | 0 |
| 25.02.2014 15:00 - 16:00 | 0 | 0 | 0 | 0 |
| 25.02.2014 16:00 - 17:00 | 0 | 0 | 0 | 0 |
| 25.02.2014 17:00 - 18:00 | 0 | 0 | 0 | 0 |
| 25.02.2014 18:00 - 19:00 | 0 | 0 | 0 | 0 |
| 25.02.2014 19:00 - 20:00 | 0 | 0 | 0 | 0 |
| 25.02.2014 20:00 - 21:00 | 0 | 0 | 0 | 0 |
| 25.02.2014 21:00 - 22:00 | 0 | 0 | 0 | 0 |
| 25.02.2014 22:00 - 23:00 | 0 | 0 | 0 | 0 |
| 25.02.2014 23:00 - 24:00 | 0 | 0 | 0 | 0 |
| 26.02.2014 00:00 - 01:00 | 0 | 0 | 0 | 0 |
| 26.02.2014 01:00 - 02:00 | 0 | 0 | 0 | 0 |
| 26.02.2014 02:00 - 03:00 | 0 | 0 | 0 | 0 |
| 26.02.2014 03:00 - 04:00 | 0 | 0 | 0 | 0 |
| 26.02.2014 04:00 - 05:00 | 0 | 0 | 0 | 0 |
| 26.02.2014 05:00 - 06:00 | 0 | 0 | 0 | 0 |
| 26.02.2014 06:00 - 07:00 | 0 | 0 | 0 | 0 |
| 26.02.2014 07:00 - 08:00 | 0 | 0 | 0 | 0 |
| 26.02.2014 08:00 - 09:00 | 0 | 0 | 0 | 0 |
| 26.02.2014 09:00 - 10:00 | 0 | 0 | 0 | 0 |
| 26.02.2014 10:00 - 11:00 | 0 | 0 | 0 | 0 |
| 26.02.2014 11:00 - 12:00 | 0 | 0 | 0 | 0 |
| 26.02.2014 12:00 - 13:00 | 0 | 0 | 0 | 0 |
| 26.02.2014 13:00 - 14:00 | 0 | 0 | 0 | 0 |
| 26.02.2014 14:00 - 15:00 | 0 | -100 | 0 | 0 |
| 26.02.2014 15:00 - 16:00 | 0 | -100 | 0 | 0 |
| 26.02.2014 16:00 - 17:00 | 0 | -100 | 0 | 0 |
| 26.02.2014 17:00 - 18:00 | 0 | -100 | 0 | 0 |
| 26.02.2014 18:00 - 19:00 | 0 | -100 | 0 | 0 |
| 26.02.2014 19:00 - 20:00 | 0 | -150 | 0 | 0 |
| 26.02.2014 20:00 - 21:00 | 0 | -150 | 0 | 0 |
| 26.02.2014 21:00 - 22:00 | 0 | -150 | 0 | 0 |
| 26.02.2014 22:00 - 23:00 | 0 | -150 | 0 | 0 |
| 26.02.2014 23:00 - 24:00 | 0 | -150 | 0 | 0 |
| 27.02.2014 00:00 - 01:00 | 0 | -200 | 0 | 0 |
| 27.02.2014 01:00 - 02:00 | 0 | -200 | 0 | 0 |
| 27.02.2014 02:00 - 03:00 | 0 | -200 | 0 | 0 |
| 27.02.2014 03:00 - 04:00 | 0 | -200 | 0 | 0 |
| 27.02.2014 04:00 - 05:00 | 0 | -200 | 0 | 0 |
| 27.02.2014 05:00 - 06:00 | 0 | -200 | 0 | 0 |
| 27.02.2014 06:00 - 07:00 | 0 | 0 | 0 | 0 |
| 27.02.2014 07:00 - 08:00 | 0 | 0 | 0 | 0 |
| 27.02.2014 08:00 - 09:00 | 0 | 0 | 0 | 0 |
| 27.02.2014 09:00 - 10:00 | 0 | 0 | 0 | 0 |
| 27.02.2014 10:00 - 11:00 | 0 | 0 | 0 | 0 |
| 27.02.2014 11:00 - 12:00 | 0 | 0 | 0 | 0 |
| 27.02.2014 12:00 - 13:00 | 0 | 0 | 0 | 0 |
| 27.02.2014 12:00 - 13:00 | 0 | 0 | 0 | 0 |
| 27.02.2014 13:00 - 14:00 | 0 | 0 | 0 | 0 |
| 27.02.2014 14:00 - 15:00 | 0 | 0 | 0 | 0 |
| 27.02.2014 15:00 - 16:00 | 0 | 0 | 0 | 0 |
| 27.02.2014 16:00 - 17:00 | 0 | 0 | 0 | 0 |
| 27.02.2014 17:00 - 18:00 | 0 | 0 | 0 | 0 |
| 27.02.2014 18:00 - 19:00 | 0 | -50 | 0 | 0 |
| 27.02.2014 19:00 - 20:00 | 0 | -50 | 0 | 0 |
| 27.02.2014 20:00 - 21:00 | 0 | -50 | 0 | 0 |
| 27.02.2014 21:00 - 22:00 | 0 | -50 | 0 | 0 |
| 27.02.2014 22:00 - 23:00 | 0 | -50 | 0 | 0 |
| 27.02.2014 23:00 - 24:00 | 0 | -50 | 0 | 0 |
| 28.02.2014 00:00 - 01:00 | 0 | -50 | 0 | 0 |
| 28.02.2014 01:00 - 02:00 | 0 | -50 | 0 | 0 |
| 28.02.2014 02:00 - 03:00 | 0 | -50 | 0 | 0 |
| 28.02.2014 03:00 - 04:00 | 0 | -50 | 0 | 0 |
| 28.02.2014 04:00 - 05:00 | 0 | -50 | 0 | 0 |
| 28.02.2014 05:00 - 06:00 | 0 | -50 | 0 | 0 |
| 28.02.2014 06:00 - 07:00 | 0 | 0 | 0 | 0 |
| 28.02.2014 07:00 - 08:00 | 0 | 0 | 0 | 0 |
| 28.02.2014 08:00 - 09:00 | 0 | 0 | 0 | 0 |
| 28.02.2014 09:00 - 10:00 | 0 | 0 | 0 | 0 |
| 28.02.2014 10:00 - 11:00 | 0 | 0 | 0 | 0 |
| 28.02.2014 11:00 - 12:00 | 0 | 0 | 0 | 0 |
| 28.02.2014 12:00 - 13:00 | 0 | 0 | 0 | 0 |
| 28.02.2014 13:00 - 14:00 | 0 | 0 | 0 | 0 |
| 28.02.2014 14:00 - 15:00 | 0 | 0 | 0 | 0 |
| 28.02.2014 15:00 - 16:00 | 0 | 0 | 0 | 0 |
| 28.02.2014 16:00 - 17:00 | 0 | 0 | 0 | 0 |
| 28.02.2014 17:00 - 18:00 | 0 | 0 | 0 | 0 |
| 28.02.2014 18:00 - 19:00 | 0 | -130 | 0 | 0 |
| 28.02.2014 19:00 - 20:00 | 0 | -130 | 0 | 0 |
| 28.02.2014 20:00 - 21:00 | 0 | -130 | 0 | 0 |
| 28.02.2014 21:00 - 22:00 | 0 | -130 | 0 | 0 |
| 28.02.2014 22:00 - 23:00 | 0 | -130 | 0 | 0 |
| 28.02.2014 23:00 - 24:00 | 0 | -130 | 0 | 0 |
| 01.03.2014 00:00 - 01:00 | 0 | -130 | 0 | 0 |
| 01.03.2014 01:00 - 02:00 | 0 | -130 | 0 | 0 |
| 01.03.2014 02:00 - 03:00 | 0 | -130 | 0 | 0 |
| 01.03.2014 03:00 - 04:00 | 0 | -130 | 0 | 0 |
| 01.03.2014 04:00 - 05:00 | 0 | -130 | 0 | 0 |
| 01.03.2014 05:00 - 06:00 | 0 | -130 | 0 | 0 |